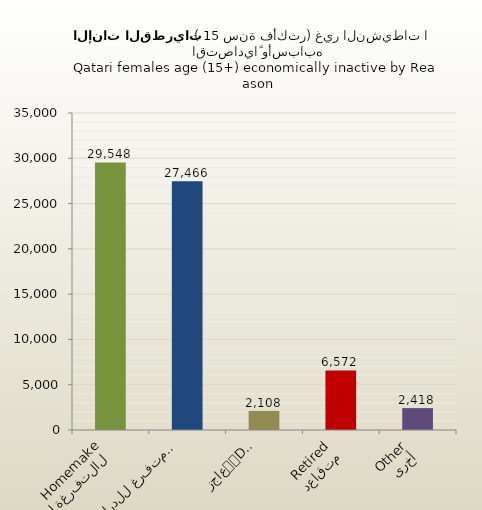
| Category | الاناث القطريات |
|---|---|
| التفرغة لأعمال المنزل
Homemaker | 29548 |
| متفرغ للدراسة
Student | 27466 |
| عاجز
Disabled | 2108 |
| متقاعد
Retired | 6572 |
| أخرى
Other | 2418 |